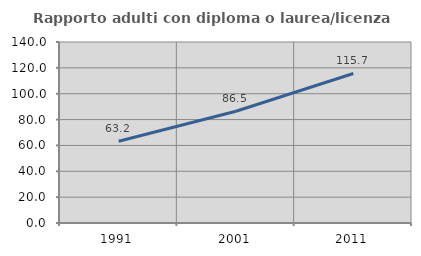
| Category | Rapporto adulti con diploma o laurea/licenza media  |
|---|---|
| 1991.0 | 63.235 |
| 2001.0 | 86.464 |
| 2011.0 | 115.67 |